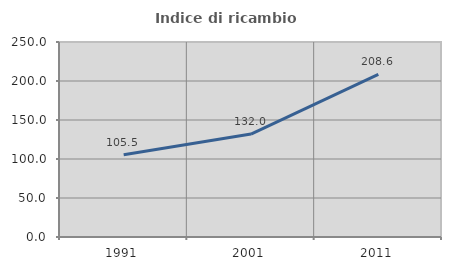
| Category | Indice di ricambio occupazionale  |
|---|---|
| 1991.0 | 105.495 |
| 2001.0 | 131.951 |
| 2011.0 | 208.569 |